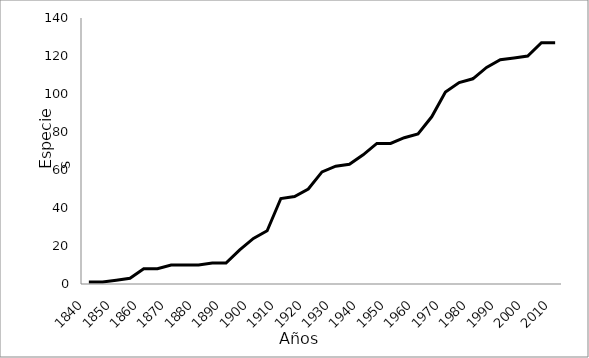
| Category | Series 0 |
|---|---|
| 1840.0 | 1 |
| 1845.0 | 1 |
| 1850.0 | 2 |
| 1855.0 | 3 |
| 1860.0 | 8 |
| 1865.0 | 8 |
| 1870.0 | 10 |
| 1875.0 | 10 |
| 1880.0 | 10 |
| 1885.0 | 11 |
| 1890.0 | 11 |
| 1895.0 | 18 |
| 1900.0 | 24 |
| 1905.0 | 28 |
| 1910.0 | 45 |
| 1915.0 | 46 |
| 1920.0 | 50 |
| 1925.0 | 59 |
| 1930.0 | 62 |
| 1935.0 | 63 |
| 1940.0 | 68 |
| 1945.0 | 74 |
| 1950.0 | 74 |
| 1955.0 | 77 |
| 1960.0 | 79 |
| 1965.0 | 88 |
| 1970.0 | 101 |
| 1975.0 | 106 |
| 1980.0 | 108 |
| 1985.0 | 114 |
| 1990.0 | 118 |
| 1995.0 | 119 |
| 2000.0 | 120 |
| 2005.0 | 127 |
| 2010.0 | 127 |